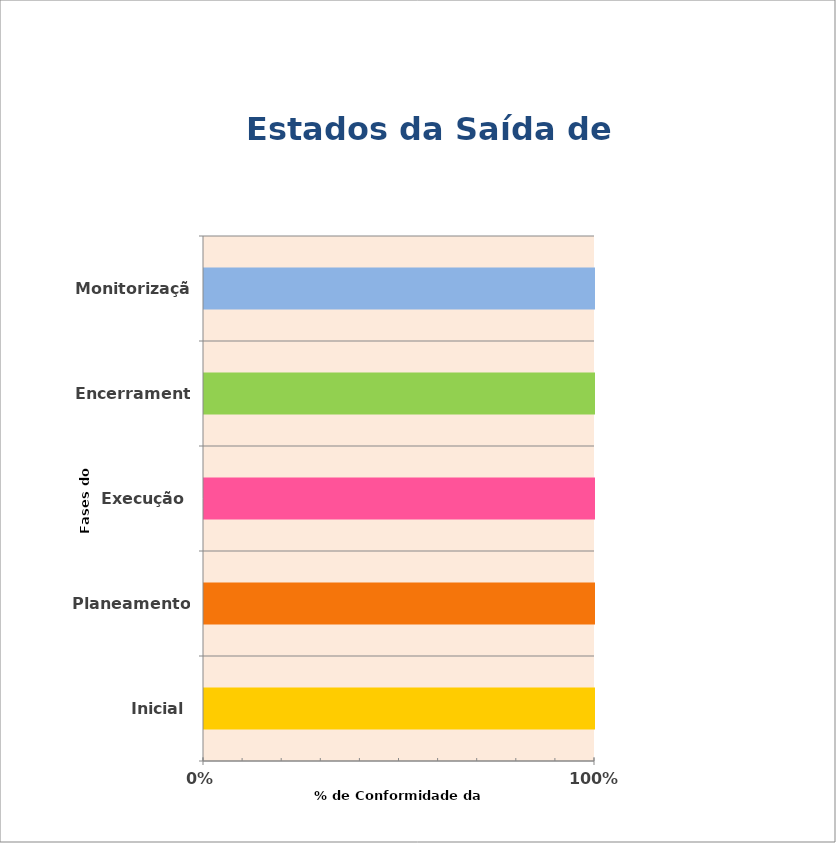
| Category | Series 0 |
|---|---|
| Inicial | 1 |
| Planeamento | 1 |
| Execução | 1 |
| Encerramento | 1 |
| Monitorização | 1 |